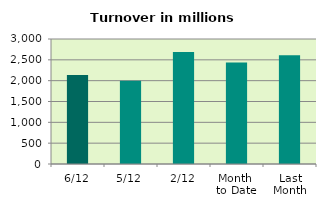
| Category | Series 0 |
|---|---|
| 6/12 | 2135.799 |
| 5/12 | 1996.93 |
| 2/12 | 2687.404 |
| Month 
to Date | 2438.852 |
| Last
Month | 2611.78 |